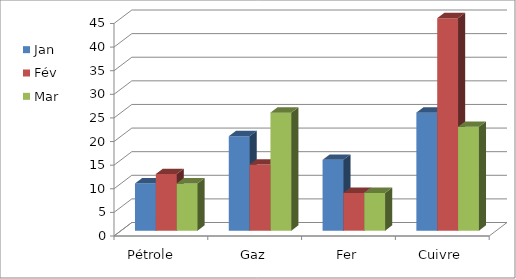
| Category | Jan | Fév | Mar |
|---|---|---|---|
| Pétrole     | 10 | 12 | 10 |
| Gaz | 20 | 14 | 25 |
| Fer | 15 | 8 | 8 |
| Cuivre | 25 | 45 | 22 |